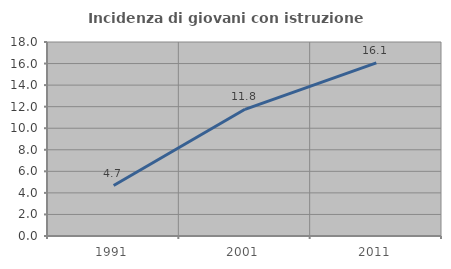
| Category | Incidenza di giovani con istruzione universitaria |
|---|---|
| 1991.0 | 4.682 |
| 2001.0 | 11.754 |
| 2011.0 | 16.057 |